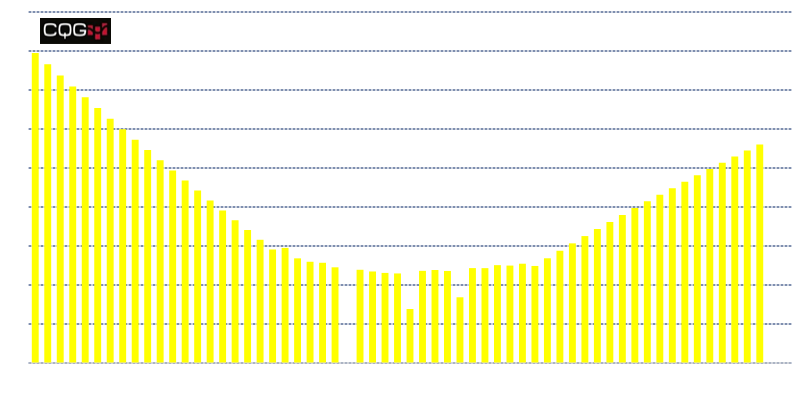
| Category | Implied Volatility |
|---|---|
| 3700 |  |
| 3750 |  |
| 3800 |  |
| 3850 |  |
| 3900 |  |
| 3950 |  |
| 4000 |  |
| 4050 |  |
| 4100 |  |
| 4150 |  |
| 4200 |  |
| 4250 |  |
| 4300 |  |
| 4350 |  |
| 4400 |  |
| 4450 |  |
| 4500 |  |
| 4550 |  |
| 4600 |  |
| 4650 |  |
| 4700 |  |
| 4750 |  |
| 4800 |  |
| 4850 |  |
| 4900 |  |
| 4950 |  |
| 5000 |  |
| 5050 |  |
| 5100 |  |
| 5150 |  |
| 5200 |  |
| 5250 |  |
| 5300 |  |
| 5350 |  |
| 5400 |  |
| 5450 |  |
| 5500 |  |
| 5550 |  |
| 5600 |  |
| 5650 |  |
| 5700 |  |
| 5750 |  |
| 5800 |  |
| 5850 |  |
| 5900 |  |
| 5950 |  |
| 6000 |  |
| 6050 |  |
| 6100 |  |
| 6150 |  |
| 6200 |  |
| 6250 |  |
| 6300 |  |
| 6350 |  |
| 6400 |  |
| 6450 |  |
| 6500 |  |
| 6550 |  |
| 6600 |  |
| 6650 |  |
| 6700 |  |